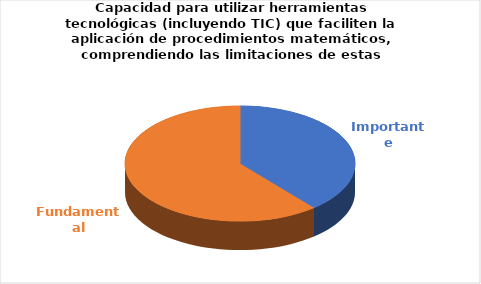
| Category | Series 0 |
|---|---|
| Importante | 7 |
| Fundamental | 11 |